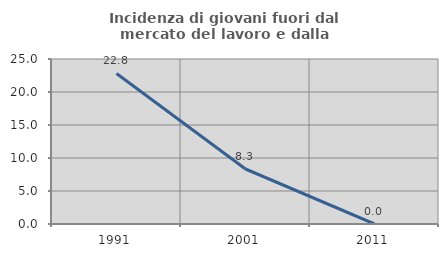
| Category | Incidenza di giovani fuori dal mercato del lavoro e dalla formazione  |
|---|---|
| 1991.0 | 22.807 |
| 2001.0 | 8.333 |
| 2011.0 | 0 |